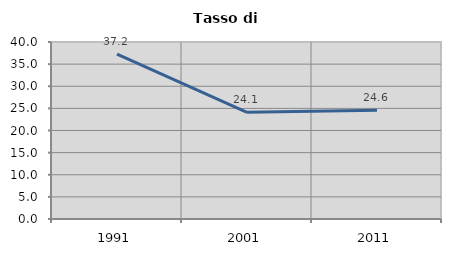
| Category | Tasso di disoccupazione   |
|---|---|
| 1991.0 | 37.25 |
| 2001.0 | 24.105 |
| 2011.0 | 24.557 |